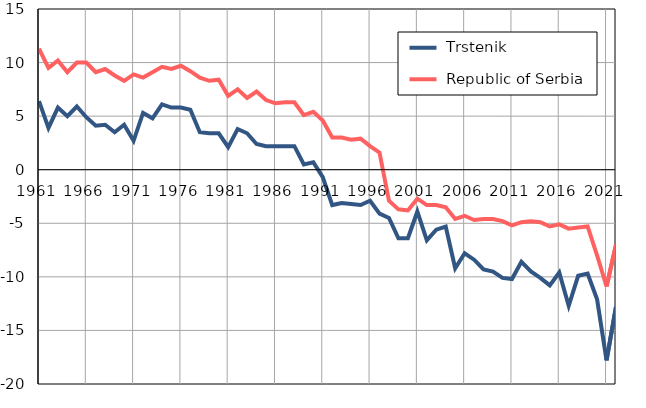
| Category |  Trstenik |  Republic of Serbia |
|---|---|---|
| 1961.0 | 6.4 | 11.3 |
| 1962.0 | 3.9 | 9.5 |
| 1963.0 | 5.8 | 10.2 |
| 1964.0 | 5 | 9.1 |
| 1965.0 | 5.9 | 10 |
| 1966.0 | 4.9 | 10 |
| 1967.0 | 4.1 | 9.1 |
| 1968.0 | 4.2 | 9.4 |
| 1969.0 | 3.5 | 8.8 |
| 1970.0 | 4.2 | 8.3 |
| 1971.0 | 2.7 | 8.9 |
| 1972.0 | 5.3 | 8.6 |
| 1973.0 | 4.8 | 9.1 |
| 1974.0 | 6.1 | 9.6 |
| 1975.0 | 5.8 | 9.4 |
| 1976.0 | 5.8 | 9.7 |
| 1977.0 | 5.6 | 9.2 |
| 1978.0 | 3.5 | 8.6 |
| 1979.0 | 3.4 | 8.3 |
| 1980.0 | 3.4 | 8.4 |
| 1981.0 | 2.1 | 6.9 |
| 1982.0 | 3.8 | 7.5 |
| 1983.0 | 3.4 | 6.7 |
| 1984.0 | 2.4 | 7.3 |
| 1985.0 | 2.2 | 6.5 |
| 1986.0 | 2.2 | 6.2 |
| 1987.0 | 2.2 | 6.3 |
| 1988.0 | 2.2 | 6.3 |
| 1989.0 | 0.5 | 5.1 |
| 1990.0 | 0.7 | 5.4 |
| 1991.0 | -0.7 | 4.6 |
| 1992.0 | -3.3 | 3 |
| 1993.0 | -3.1 | 3 |
| 1994.0 | -3.2 | 2.8 |
| 1995.0 | -3.3 | 2.9 |
| 1996.0 | -2.9 | 2.2 |
| 1997.0 | -4.1 | 1.6 |
| 1998.0 | -4.5 | -2.9 |
| 1999.0 | -6.4 | -3.7 |
| 2000.0 | -6.4 | -3.8 |
| 2001.0 | -3.9 | -2.7 |
| 2002.0 | -6.6 | -3.3 |
| 2003.0 | -5.6 | -3.3 |
| 2004.0 | -5.3 | -3.5 |
| 2005.0 | -9.2 | -4.6 |
| 2006.0 | -7.8 | -4.3 |
| 2007.0 | -8.4 | -4.7 |
| 2008.0 | -9.3 | -4.6 |
| 2009.0 | -9.5 | -4.6 |
| 2010.0 | -10.1 | -4.8 |
| 2011.0 | -10.2 | -5.2 |
| 2012.0 | -8.6 | -4.9 |
| 2013.0 | -9.5 | -4.8 |
| 2014.0 | -10.1 | -4.9 |
| 2015.0 | -10.8 | -5.3 |
| 2016.0 | -9.6 | -5.1 |
| 2017.0 | -12.7 | -5.5 |
| 2018.0 | -9.9 | -5.4 |
| 2019.0 | -9.7 | -5.3 |
| 2020.0 | -12.1 | -8 |
| 2021.0 | -17.8 | -10.9 |
| 2022.0 | -12.8 | -7 |